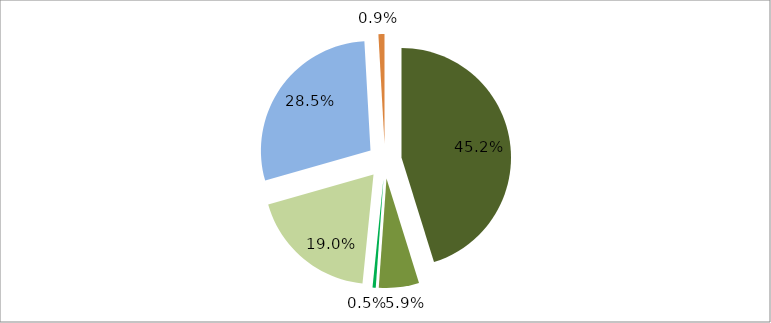
| Category | Series 0 |
|---|---|
| 0 | 0.452 |
| 1 | 0.059 |
| 2 | 0.005 |
| 3 | 0.19 |
| 4 | 0.285 |
| 5 | 0.009 |